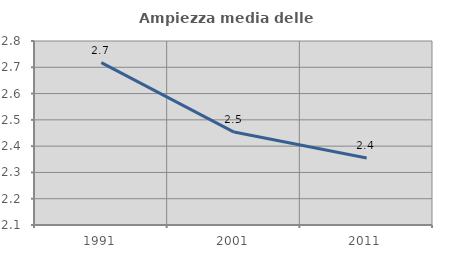
| Category | Ampiezza media delle famiglie |
|---|---|
| 1991.0 | 2.718 |
| 2001.0 | 2.453 |
| 2011.0 | 2.355 |